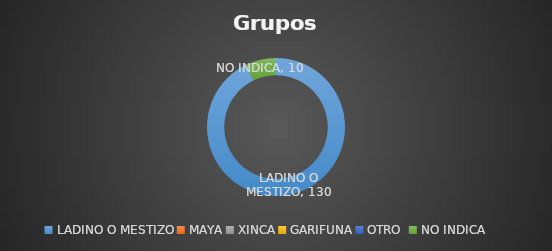
| Category | PARTICIPANTES |
|---|---|
| LADINO O MESTIZO | 130 |
| MAYA | 0 |
| XINCA | 0 |
| GARIFUNA | 0 |
| OTRO  | 0 |
| NO INDICA | 10 |